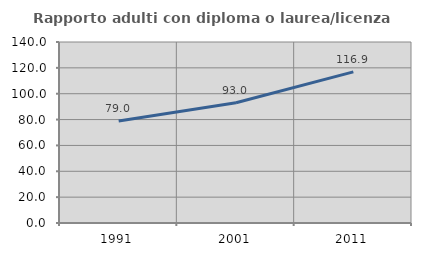
| Category | Rapporto adulti con diploma o laurea/licenza media  |
|---|---|
| 1991.0 | 78.97 |
| 2001.0 | 93.038 |
| 2011.0 | 116.905 |